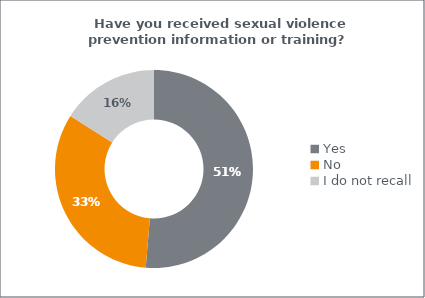
| Category | Series 0 |
|---|---|
| Yes | 0.513 |
| No | 0.327 |
| I do not recall | 0.16 |